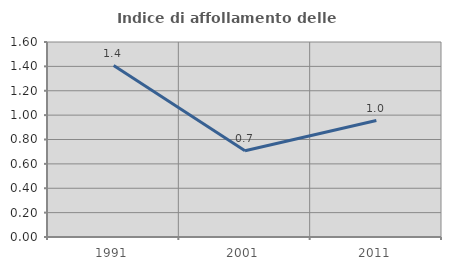
| Category | Indice di affollamento delle abitazioni  |
|---|---|
| 1991.0 | 1.406 |
| 2001.0 | 0.708 |
| 2011.0 | 0.955 |